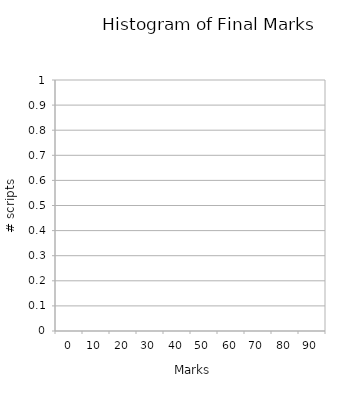
| Category | Series 1 | Series 2 |
|---|---|---|
| 0.0 | 0 | 0 |
| 10.0 | 0 | 0 |
| 20.0 | 0 | 0 |
| 30.0 | 0 | 0 |
| 40.0 | 0 | 0 |
| 50.0 | 0 | 0 |
| 60.0 | 0 | 0 |
| 70.0 | 0 | 0 |
| 80.0 | 0 | 0 |
| 90.0 | 0 | 0 |